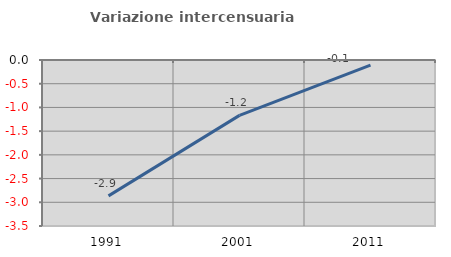
| Category | Variazione intercensuaria annua |
|---|---|
| 1991.0 | -2.864 |
| 2001.0 | -1.168 |
| 2011.0 | -0.107 |